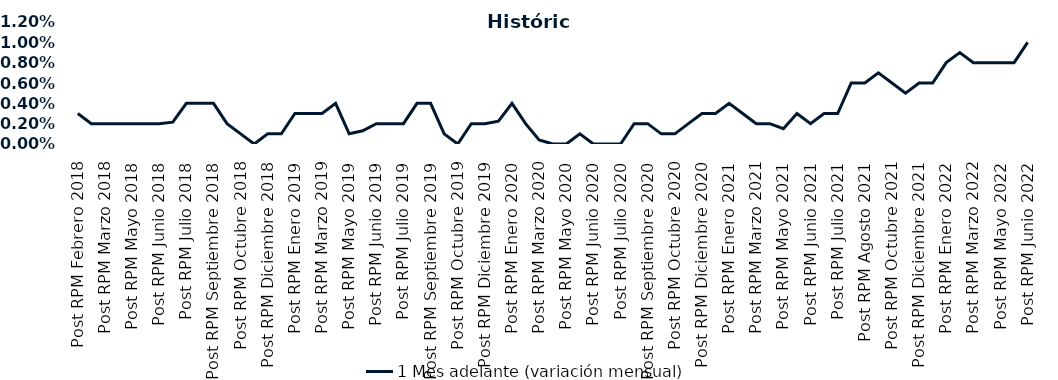
| Category | 1 Mes adelante (variación mensual) |
|---|---|
| Post RPM Febrero 2018 | 0.003 |
| Pre RPM Marzo 2018 | 0.002 |
| Post RPM Marzo 2018 | 0.002 |
| Pre RPM Mayo 2018 | 0.002 |
| Post RPM Mayo 2018 | 0.002 |
| Pre RPM Junio 2018 | 0.002 |
| Post RPM Junio 2018 | 0.002 |
| Pre RPM Julio 2018 | 0.002 |
| Post RPM Julio 2018 | 0.004 |
| Pre RPM Septiembre 2018 | 0.004 |
| Post RPM Septiembre 2018 | 0.004 |
| Pre RPM Octubre 2018 | 0.002 |
| Post RPM Octubre 2018 | 0.001 |
| Pre RPM Diciembre 2018 | 0 |
| Post RPM Diciembre 2018 | 0.001 |
| Pre RPM Enero 2019 | 0.001 |
| Post RPM Enero 2019 | 0.003 |
| Pre RPM Marzo 2019 | 0.003 |
| Post RPM Marzo 2019 | 0.003 |
| Pre RPM Mayo 2019 | 0.004 |
| Post RPM Mayo 2019 | 0.001 |
| Pre RPM Junio 2019 | 0.001 |
| Post RPM Junio 2019 | 0.002 |
| Pre RPM Julio 2019 | 0.002 |
| Post RPM Julio 2019 | 0.002 |
| Pre RPM Septiembre 2019 | 0.004 |
| Post RPM Septiembre 2019 | 0.004 |
| Pre RPM Octubre 2019 | 0.001 |
| Post RPM Octubre 2019 | 0 |
| Pre RPM Diciembre 2019 | 0.002 |
| Post RPM Diciembre 2019 | 0.002 |
| Pre RPM Enero 2020 | 0.002 |
| Post RPM Enero 2020 | 0.004 |
| Pre RPM Marzo 2020 | 0.002 |
| Post RPM Marzo 2020 | 0 |
| Pre RPM Mayo 2020 | 0 |
| Post RPM Mayo 2020 | 0 |
| Pre RPM Junio 2020 | 0.001 |
| Post RPM Junio 2020 | 0 |
| Pre RPM Julio 2020 | 0 |
| Post RPM Julio 2020 | 0 |
| Pre RPM Septiembre 2020 | 0.002 |
| Post RPM Septiembre 2020 | 0.002 |
| Pre RPM Octubre 2020 | 0.001 |
| Post RPM Octubre 2020 | 0.001 |
| Pre RPM Diciembre 2020 | 0.002 |
| Post RPM Diciembre 2020 | 0.003 |
| Pre RPM Enero 2021 | 0.003 |
| Post RPM Enero 2021 | 0.004 |
| Pre RPM Marzo 2021 | 0.003 |
| Post RPM Marzo 2021 | 0.002 |
| Pre RPM Mayo 2021 | 0.002 |
| Post RPM Mayo 2021 | 0.002 |
| Pre RPM Junio 2021 | 0.003 |
| Post RPM Junio 2021 | 0.002 |
| Pre RPM Julio 2021 | 0.003 |
| Post RPM Julio 2021 | 0.003 |
| Pre RPM Agosto 2021 | 0.006 |
| Post RPM Agosto 2021 | 0.006 |
| Pre RPM Octubre 2021 | 0.007 |
| Post RPM Octubre 2021 | 0.006 |
| Pre RPM Diciembre 2021 | 0.005 |
| Post RPM Diciembre 2021 | 0.006 |
| Pre RPM Enero 2022 | 0.006 |
| Post RPM Enero 2022 | 0.008 |
| Pre RPM Marzo 2022 | 0.009 |
| Post RPM Marzo 2022 | 0.008 |
| Pre RPM Mayo 2022 | 0.008 |
| Post RPM Mayo 2022 | 0.008 |
| Pre RPM Junio 2022 | 0.008 |
| Post RPM Junio 2022 | 0.01 |